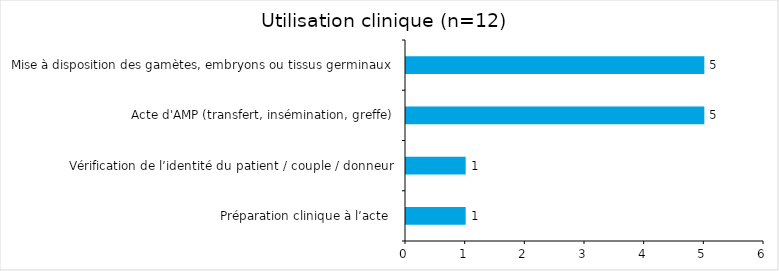
| Category | Series 0 |
|---|---|
| Préparation clinique à l’acte  | 1 |
| Vérification de l’identité du patient / couple / donneur | 1 |
| Acte d'AMP (transfert, insémination, greffe) | 5 |
| Mise à disposition des gamètes, embryons ou tissus germinaux | 5 |